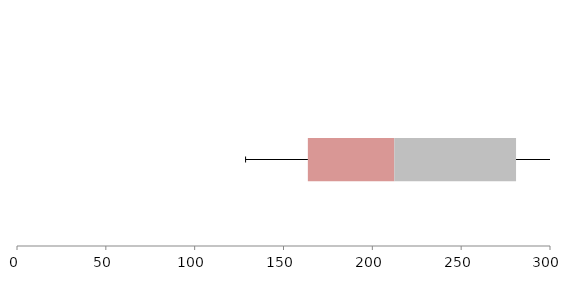
| Category | Series 1 | Series 2 | Series 3 |
|---|---|---|---|
| 0 | 163.709 | 48.651 | 68.524 |